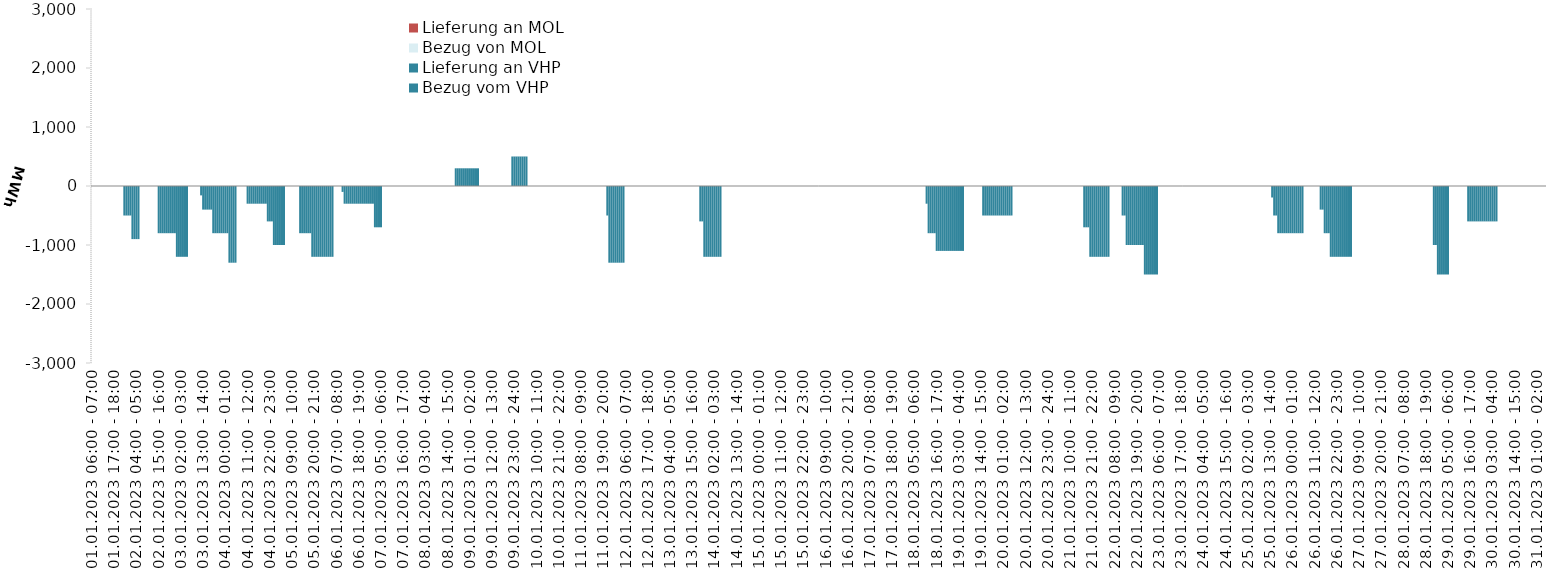
| Category | Bezug vom VHP | Lieferung an VHP | Bezug von MOL | Lieferung an MOL |
|---|---|---|---|---|
| 01.01.2023 06:00 - 07:00 | 0 | 0 | 0 | 0 |
| 01.01.2023 07:00 - 08:00 | 0 | 0 | 0 | 0 |
| 01.01.2023 08:00 - 09:00 | 0 | 0 | 0 | 0 |
| 01.01.2023 09:00 - 10:00 | 0 | 0 | 0 | 0 |
| 01.01.2023 10:00 - 11:00 | 0 | 0 | 0 | 0 |
| 01.01.2023 11:00 - 12:00 | 0 | 0 | 0 | 0 |
| 01.01.2023 12:00 - 13:00 | 0 | 0 | 0 | 0 |
| 01.01.2023 13:00 - 14:00 | 0 | 0 | 0 | 0 |
| 01.01.2023 14:00 - 15:00 | 0 | 0 | 0 | 0 |
| 01.01.2023 15:00 - 16:00 | 0 | 0 | 0 | 0 |
| 01.01.2023 16:00 - 17:00 | 0 | 0 | 0 | 0 |
| 01.01.2023 17:00 - 18:00 | 0 | 0 | 0 | 0 |
| 01.01.2023 18:00 - 19:00 | 0 | 0 | 0 | 0 |
| 01.01.2023 19:00 - 20:00 | 0 | 0 | 0 | 0 |
| 01.01.2023 20:00 - 21:00 | 0 | 0 | 0 | 0 |
| 01.01.2023 21:00 - 22:00 | 0 | 0 | 0 | 0 |
| 01.01.2023 22:00 - 23:00 | 0 | -500 | 0 | 0 |
| 01.01.2023 23:00 - 24:00 | 0 | -500 | 0 | 0 |
| 02.01.2023 00:00 - 01:00 | 0 | -500 | 0 | 0 |
| 02.01.2023 01:00 - 02:00 | 0 | -500 | 0 | 0 |
| 02.01.2023 02:00 - 03:00 | 0 | -900 | 0 | 0 |
| 02.01.2023 03:00 - 04:00 | 0 | -900 | 0 | 0 |
| 02.01.2023 04:00 - 05:00 | 0 | -900 | 0 | 0 |
| 02.01.2023 05:00 - 06:00 | 0 | -900 | 0 | 0 |
| 02.01.2023 06:00 - 07:00 | 0 | 0 | 0 | 0 |
| 02.01.2023 07:00 - 08:00 | 0 | 0 | 0 | 0 |
| 02.01.2023 08:00 - 09:00 | 0 | 0 | 0 | 0 |
| 02.01.2023 09:00 - 10:00 | 0 | 0 | 0 | 0 |
| 02.01.2023 10:00 - 11:00 | 0 | 0 | 0 | 0 |
| 02.01.2023 11:00 - 12:00 | 0 | 0 | 0 | 0 |
| 02.01.2023 12:00 - 13:00 | 0 | 0 | 0 | 0 |
| 02.01.2023 13:00 - 14:00 | 0 | 0 | 0 | 0 |
| 02.01.2023 14:00 - 15:00 | 0 | 0 | 0 | 0 |
| 02.01.2023 15:00 - 16:00 | 0 | -800 | 0 | 0 |
| 02.01.2023 16:00 - 17:00 | 0 | -800 | 0 | 0 |
| 02.01.2023 17:00 - 18:00 | 0 | -800 | 0 | 0 |
| 02.01.2023 18:00 - 19:00 | 0 | -800 | 0 | 0 |
| 02.01.2023 19:00 - 20:00 | 0 | -800 | 0 | 0 |
| 02.01.2023 20:00 - 21:00 | 0 | -800 | 0 | 0 |
| 02.01.2023 21:00 - 22:00 | 0 | -800 | 0 | 0 |
| 02.01.2023 22:00 - 23:00 | 0 | -800 | 0 | 0 |
| 02.01.2023 23:00 - 24:00 | 0 | -800 | 0 | 0 |
| 03.01.2023 00:00 - 01:00 | 0 | -1200 | 0 | 0 |
| 03.01.2023 01:00 - 02:00 | 0 | -1200 | 0 | 0 |
| 03.01.2023 02:00 - 03:00 | 0 | -1200 | 0 | 0 |
| 03.01.2023 03:00 - 04:00 | 0 | -1200 | 0 | 0 |
| 03.01.2023 04:00 - 05:00 | 0 | -1200 | 0 | 0 |
| 03.01.2023 05:00 - 06:00 | 0 | -1200 | 0 | 0 |
| 03.01.2023 06:00 - 07:00 | 0 | 0 | 0 | 0 |
| 03.01.2023 07:00 - 08:00 | 0 | 0 | 0 | 0 |
| 03.01.2023 08:00 - 09:00 | 0 | 0 | 0 | 0 |
| 03.01.2023 09:00 - 10:00 | 0 | 0 | 0 | 0 |
| 03.01.2023 10:00 - 11:00 | 0 | 0 | 0 | 0 |
| 03.01.2023 11:00 - 12:00 | 0 | 0 | 0 | 0 |
| 03.01.2023 12:00 - 13:00 | 0 | -159 | 0 | 0 |
| 03.01.2023 13:00 - 14:00 | 0 | -400 | 0 | 0 |
| 03.01.2023 14:00 - 15:00 | 0 | -400 | 0 | 0 |
| 03.01.2023 15:00 - 16:00 | 0 | -400 | 0 | 0 |
| 03.01.2023 16:00 - 17:00 | 0 | -400 | 0 | 0 |
| 03.01.2023 17:00 - 18:00 | 0 | -400 | 0 | 0 |
| 03.01.2023 18:00 - 19:00 | 0 | -800 | 0 | 0 |
| 03.01.2023 19:00 - 20:00 | 0 | -800 | 0 | 0 |
| 03.01.2023 20:00 - 21:00 | 0 | -800 | 0 | 0 |
| 03.01.2023 21:00 - 22:00 | 0 | -800 | 0 | 0 |
| 03.01.2023 22:00 - 23:00 | 0 | -800 | 0 | 0 |
| 03.01.2023 23:00 - 24:00 | 0 | -800 | 0 | 0 |
| 04.01.2023 00:00 - 01:00 | 0 | -800 | 0 | 0 |
| 04.01.2023 01:00 - 02:00 | 0 | -800 | 0 | 0 |
| 04.01.2023 02:00 - 03:00 | 0 | -1300 | 0 | 0 |
| 04.01.2023 03:00 - 04:00 | 0 | -1300 | 0 | 0 |
| 04.01.2023 04:00 - 05:00 | 0 | -1300 | 0 | 0 |
| 04.01.2023 05:00 - 06:00 | 0 | -1300 | 0 | 0 |
| 04.01.2023 06:00 - 07:00 | 0 | 0 | 0 | 0 |
| 04.01.2023 07:00 - 08:00 | 0 | 0 | 0 | 0 |
| 04.01.2023 08:00 - 09:00 | 0 | 0 | 0 | 0 |
| 04.01.2023 09:00 - 10:00 | 0 | 0 | 0 | 0 |
| 04.01.2023 10:00 - 11:00 | 0 | 0 | 0 | 0 |
| 04.01.2023 11:00 - 12:00 | 0 | -300 | 0 | 0 |
| 04.01.2023 12:00 - 13:00 | 0 | -300 | 0 | 0 |
| 04.01.2023 13:00 - 14:00 | 0 | -300 | 0 | 0 |
| 04.01.2023 14:00 - 15:00 | 0 | -300 | 0 | 0 |
| 04.01.2023 15:00 - 16:00 | 0 | -300 | 0 | 0 |
| 04.01.2023 16:00 - 17:00 | 0 | -300 | 0 | 0 |
| 04.01.2023 17:00 - 18:00 | 0 | -300 | 0 | 0 |
| 04.01.2023 18:00 - 19:00 | 0 | -300 | 0 | 0 |
| 04.01.2023 19:00 - 20:00 | 0 | -300 | 0 | 0 |
| 04.01.2023 20:00 - 21:00 | 0 | -300 | 0 | 0 |
| 04.01.2023 21:00 - 22:00 | 0 | -600 | 0 | 0 |
| 04.01.2023 22:00 - 23:00 | 0 | -600 | 0 | 0 |
| 04.01.2023 23:00 - 24:00 | 0 | -600 | 0 | 0 |
| 05.01.2023 00:00 - 01:00 | 0 | -1000 | 0 | 0 |
| 05.01.2023 01:00 - 02:00 | 0 | -1000 | 0 | 0 |
| 05.01.2023 02:00 - 03:00 | 0 | -1000 | 0 | 0 |
| 05.01.2023 03:00 - 04:00 | 0 | -1000 | 0 | 0 |
| 05.01.2023 04:00 - 05:00 | 0 | -1000 | 0 | 0 |
| 05.01.2023 05:00 - 06:00 | 0 | -1000 | 0 | 0 |
| 05.01.2023 06:00 - 07:00 | 0 | 0 | 0 | 0 |
| 05.01.2023 07:00 - 08:00 | 0 | 0 | 0 | 0 |
| 05.01.2023 08:00 - 09:00 | 0 | 0 | 0 | 0 |
| 05.01.2023 09:00 - 10:00 | 0 | 0 | 0 | 0 |
| 05.01.2023 10:00 - 11:00 | 0 | 0 | 0 | 0 |
| 05.01.2023 11:00 - 12:00 | 0 | 0 | 0 | 0 |
| 05.01.2023 12:00 - 13:00 | 0 | 0 | 0 | 0 |
| 05.01.2023 13:00 - 14:00 | 0 | -800 | 0 | 0 |
| 05.01.2023 14:00 - 15:00 | 0 | -800 | 0 | 0 |
| 05.01.2023 15:00 - 16:00 | 0 | -800 | 0 | 0 |
| 05.01.2023 16:00 - 17:00 | 0 | -800 | 0 | 0 |
| 05.01.2023 17:00 - 18:00 | 0 | -800 | 0 | 0 |
| 05.01.2023 18:00 - 19:00 | 0 | -800 | 0 | 0 |
| 05.01.2023 19:00 - 20:00 | 0 | -1200 | 0 | 0 |
| 05.01.2023 20:00 - 21:00 | 0 | -1200 | 0 | 0 |
| 05.01.2023 21:00 - 22:00 | 0 | -1200 | 0 | 0 |
| 05.01.2023 22:00 - 23:00 | 0 | -1200 | 0 | 0 |
| 05.01.2023 23:00 - 24:00 | 0 | -1200 | 0 | 0 |
| 06.01.2023 00:00 - 01:00 | 0 | -1200 | 0 | 0 |
| 06.01.2023 01:00 - 02:00 | 0 | -1200 | 0 | 0 |
| 06.01.2023 02:00 - 03:00 | 0 | -1200 | 0 | 0 |
| 06.01.2023 03:00 - 04:00 | 0 | -1200 | 0 | 0 |
| 06.01.2023 04:00 - 05:00 | 0 | -1200 | 0 | 0 |
| 06.01.2023 05:00 - 06:00 | 0 | -1200 | 0 | 0 |
| 06.01.2023 06:00 - 07:00 | 0 | 0 | 0 | 0 |
| 06.01.2023 07:00 - 08:00 | 0 | 0 | 0 | 0 |
| 06.01.2023 08:00 - 09:00 | 0 | 0 | 0 | 0 |
| 06.01.2023 09:00 - 10:00 | 0 | 0 | 0 | 0 |
| 06.01.2023 10:00 - 11:00 | 0 | -100 | 0 | 0 |
| 06.01.2023 11:00 - 12:00 | 0 | -300 | 0 | 0 |
| 06.01.2023 12:00 - 13:00 | 0 | -300 | 0 | 0 |
| 06.01.2023 13:00 - 14:00 | 0 | -300 | 0 | 0 |
| 06.01.2023 14:00 - 15:00 | 0 | -300 | 0 | 0 |
| 06.01.2023 15:00 - 16:00 | 0 | -300 | 0 | 0 |
| 06.01.2023 16:00 - 17:00 | 0 | -300 | 0 | 0 |
| 06.01.2023 17:00 - 18:00 | 0 | -300 | 0 | 0 |
| 06.01.2023 18:00 - 19:00 | 0 | -300 | 0 | 0 |
| 06.01.2023 19:00 - 20:00 | 0 | -300 | 0 | 0 |
| 06.01.2023 20:00 - 21:00 | 0 | -300 | 0 | 0 |
| 06.01.2023 21:00 - 22:00 | 0 | -300 | 0 | 0 |
| 06.01.2023 22:00 - 23:00 | 0 | -300 | 0 | 0 |
| 06.01.2023 23:00 - 24:00 | 0 | -300 | 0 | 0 |
| 07.01.2023 00:00 - 01:00 | 0 | -300 | 0 | 0 |
| 07.01.2023 01:00 - 02:00 | 0 | -300 | 0 | 0 |
| 07.01.2023 02:00 - 03:00 | 0 | -700 | 0 | 0 |
| 07.01.2023 03:00 - 04:00 | 0 | -700 | 0 | 0 |
| 07.01.2023 04:00 - 05:00 | 0 | -700 | 0 | 0 |
| 07.01.2023 05:00 - 06:00 | 0 | -700 | 0 | 0 |
| 07.01.2023 06:00 - 07:00 | 0 | 0 | 0 | 0 |
| 07.01.2023 07:00 - 08:00 | 0 | 0 | 0 | 0 |
| 07.01.2023 08:00 - 09:00 | 0 | 0 | 0 | 0 |
| 07.01.2023 09:00 - 10:00 | 0 | 0 | 0 | 0 |
| 07.01.2023 10:00 - 11:00 | 0 | 0 | 0 | 0 |
| 07.01.2023 11:00 - 12:00 | 0 | 0 | 0 | 0 |
| 07.01.2023 12:00 - 13:00 | 0 | 0 | 0 | 0 |
| 07.01.2023 13:00 - 14:00 | 0 | 0 | 0 | 0 |
| 07.01.2023 14:00 - 15:00 | 0 | 0 | 0 | 0 |
| 07.01.2023 15:00 - 16:00 | 0 | 0 | 0 | 0 |
| 07.01.2023 16:00 - 17:00 | 0 | 0 | 0 | 0 |
| 07.01.2023 17:00 - 18:00 | 0 | 0 | 0 | 0 |
| 07.01.2023 18:00 - 19:00 | 0 | 0 | 0 | 0 |
| 07.01.2023 19:00 - 20:00 | 0 | 0 | 0 | 0 |
| 07.01.2023 20:00 - 21:00 | 0 | 0 | 0 | 0 |
| 07.01.2023 21:00 - 22:00 | 0 | 0 | 0 | 0 |
| 07.01.2023 22:00 - 23:00 | 0 | 0 | 0 | 0 |
| 07.01.2023 23:00 - 24:00 | 0 | 0 | 0 | 0 |
| 08.01.2023 00:00 - 01:00 | 0 | 0 | 0 | 0 |
| 08.01.2023 01:00 - 02:00 | 0 | 0 | 0 | 0 |
| 08.01.2023 02:00 - 03:00 | 0 | 0 | 0 | 0 |
| 08.01.2023 03:00 - 04:00 | 0 | 0 | 0 | 0 |
| 08.01.2023 04:00 - 05:00 | 0 | 0 | 0 | 0 |
| 08.01.2023 05:00 - 06:00 | 0 | 0 | 0 | 0 |
| 08.01.2023 06:00 - 07:00 | 0 | 0 | 0 | 0 |
| 08.01.2023 07:00 - 08:00 | 0 | 0 | 0 | 0 |
| 08.01.2023 08:00 - 09:00 | 0 | 0 | 0 | 0 |
| 08.01.2023 09:00 - 10:00 | 0 | 0 | 0 | 0 |
| 08.01.2023 10:00 - 11:00 | 0 | 0 | 0 | 0 |
| 08.01.2023 11:00 - 12:00 | 0 | 0 | 0 | 0 |
| 08.01.2023 12:00 - 13:00 | 0 | 0 | 0 | 0 |
| 08.01.2023 13:00 - 14:00 | 0 | 0 | 0 | 0 |
| 08.01.2023 14:00 - 15:00 | 0 | 0 | 0 | 0 |
| 08.01.2023 15:00 - 16:00 | 0 | 0 | 0 | 0 |
| 08.01.2023 16:00 - 17:00 | 0 | 0 | 0 | 0 |
| 08.01.2023 17:00 - 18:00 | 0 | 0 | 0 | 0 |
| 08.01.2023 18:00 - 19:00 | 300 | 0 | 0 | 0 |
| 08.01.2023 19:00 - 20:00 | 300 | 0 | 0 | 0 |
| 08.01.2023 20:00 - 21:00 | 300 | 0 | 0 | 0 |
| 08.01.2023 21:00 - 22:00 | 300 | 0 | 0 | 0 |
| 08.01.2023 22:00 - 23:00 | 300 | 0 | 0 | 0 |
| 08.01.2023 23:00 - 24:00 | 300 | 0 | 0 | 0 |
| 09.01.2023 00:00 - 01:00 | 300 | 0 | 0 | 0 |
| 09.01.2023 01:00 - 02:00 | 300 | 0 | 0 | 0 |
| 09.01.2023 02:00 - 03:00 | 300 | 0 | 0 | 0 |
| 09.01.2023 03:00 - 04:00 | 300 | 0 | 0 | 0 |
| 09.01.2023 04:00 - 05:00 | 300 | 0 | 0 | 0 |
| 09.01.2023 05:00 - 06:00 | 300 | 0 | 0 | 0 |
| 09.01.2023 06:00 - 07:00 | 0 | 0 | 0 | 0 |
| 09.01.2023 07:00 - 08:00 | 0 | 0 | 0 | 0 |
| 09.01.2023 08:00 - 09:00 | 0 | 0 | 0 | 0 |
| 09.01.2023 09:00 - 10:00 | 0 | 0 | 0 | 0 |
| 09.01.2023 10:00 - 11:00 | 0 | 0 | 0 | 0 |
| 09.01.2023 11:00 - 12:00 | 0 | 0 | 0 | 0 |
| 09.01.2023 12:00 - 13:00 | 0 | 0 | 0 | 0 |
| 09.01.2023 13:00 - 14:00 | 0 | 0 | 0 | 0 |
| 09.01.2023 14:00 - 15:00 | 0 | 0 | 0 | 0 |
| 09.01.2023 15:00 - 16:00 | 0 | 0 | 0 | 0 |
| 09.01.2023 16:00 - 17:00 | 0 | 0 | 0 | 0 |
| 09.01.2023 17:00 - 18:00 | 0 | 0 | 0 | 0 |
| 09.01.2023 18:00 - 19:00 | 0 | 0 | 0 | 0 |
| 09.01.2023 19:00 - 20:00 | 0 | 0 | 0 | 0 |
| 09.01.2023 20:00 - 21:00 | 0 | 0 | 0 | 0 |
| 09.01.2023 21:00 - 22:00 | 0 | 0 | 0 | 0 |
| 09.01.2023 22:00 - 23:00 | 500 | 0 | 0 | 0 |
| 09.01.2023 23:00 - 24:00 | 500 | 0 | 0 | 0 |
| 10.01.2023 00:00 - 01:00 | 500 | 0 | 0 | 0 |
| 10.01.2023 01:00 - 02:00 | 500 | 0 | 0 | 0 |
| 10.01.2023 02:00 - 03:00 | 500 | 0 | 0 | 0 |
| 10.01.2023 03:00 - 04:00 | 500 | 0 | 0 | 0 |
| 10.01.2023 04:00 - 05:00 | 500 | 0 | 0 | 0 |
| 10.01.2023 05:00 - 06:00 | 500 | 0 | 0 | 0 |
| 10.01.2023 06:00 - 07:00 | 0 | 0 | 0 | 0 |
| 10.01.2023 07:00 - 08:00 | 0 | 0 | 0 | 0 |
| 10.01.2023 08:00 - 09:00 | 0 | 0 | 0 | 0 |
| 10.01.2023 09:00 - 10:00 | 0 | 0 | 0 | 0 |
| 10.01.2023 10:00 - 11:00 | 0 | 0 | 0 | 0 |
| 10.01.2023 11:00 - 12:00 | 0 | 0 | 0 | 0 |
| 10.01.2023 12:00 - 13:00 | 0 | 0 | 0 | 0 |
| 10.01.2023 13:00 - 14:00 | 0 | 0 | 0 | 0 |
| 10.01.2023 14:00 - 15:00 | 0 | 0 | 0 | 0 |
| 10.01.2023 15:00 - 16:00 | 0 | 0 | 0 | 0 |
| 10.01.2023 16:00 - 17:00 | 0 | 0 | 0 | 0 |
| 10.01.2023 17:00 - 18:00 | 0 | 0 | 0 | 0 |
| 10.01.2023 18:00 - 19:00 | 0 | 0 | 0 | 0 |
| 10.01.2023 19:00 - 20:00 | 0 | 0 | 0 | 0 |
| 10.01.2023 20:00 - 21:00 | 0 | 0 | 0 | 0 |
| 10.01.2023 21:00 - 22:00 | 0 | 0 | 0 | 0 |
| 10.01.2023 22:00 - 23:00 | 0 | 0 | 0 | 0 |
| 10.01.2023 23:00 - 24:00 | 0 | 0 | 0 | 0 |
| 11.01.2023 00:00 - 01:00 | 0 | 0 | 0 | 0 |
| 11.01.2023 01:00 - 02:00 | 0 | 0 | 0 | 0 |
| 11.01.2023 02:00 - 03:00 | 0 | 0 | 0 | 0 |
| 11.01.2023 03:00 - 04:00 | 0 | 0 | 0 | 0 |
| 11.01.2023 04:00 - 05:00 | 0 | 0 | 0 | 0 |
| 11.01.2023 05:00 - 06:00 | 0 | 0 | 0 | 0 |
| 11.01.2023 06:00 - 07:00 | 0 | 0 | 0 | 0 |
| 11.01.2023 07:00 - 08:00 | 0 | 0 | 0 | 0 |
| 11.01.2023 08:00 - 09:00 | 0 | 0 | 0 | 0 |
| 11.01.2023 09:00 - 10:00 | 0 | 0 | 0 | 0 |
| 11.01.2023 10:00 - 11:00 | 0 | 0 | 0 | 0 |
| 11.01.2023 11:00 - 12:00 | 0 | 0 | 0 | 0 |
| 11.01.2023 12:00 - 13:00 | 0 | 0 | 0 | 0 |
| 11.01.2023 13:00 - 14:00 | 0 | 0 | 0 | 0 |
| 11.01.2023 14:00 - 15:00 | 0 | 0 | 0 | 0 |
| 11.01.2023 15:00 - 16:00 | 0 | 0 | 0 | 0 |
| 11.01.2023 16:00 - 17:00 | 0 | 0 | 0 | 0 |
| 11.01.2023 17:00 - 18:00 | 0 | 0 | 0 | 0 |
| 11.01.2023 18:00 - 19:00 | 0 | 0 | 0 | 0 |
| 11.01.2023 19:00 - 20:00 | 0 | 0 | 0 | 0 |
| 11.01.2023 20:00 - 21:00 | 0 | 0 | 0 | 0 |
| 11.01.2023 21:00 - 22:00 | 0 | -500 | 0 | 0 |
| 11.01.2023 22:00 - 23:00 | 0 | -1300 | 0 | 0 |
| 11.01.2023 23:00 - 24:00 | 0 | -1300 | 0 | 0 |
| 12.01.2023 00:00 - 01:00 | 0 | -1300 | 0 | 0 |
| 12.01.2023 01:00 - 02:00 | 0 | -1300 | 0 | 0 |
| 12.01.2023 02:00 - 03:00 | 0 | -1300 | 0 | 0 |
| 12.01.2023 03:00 - 04:00 | 0 | -1300 | 0 | 0 |
| 12.01.2023 04:00 - 05:00 | 0 | -1300 | 0 | 0 |
| 12.01.2023 05:00 - 06:00 | 0 | -1300 | 0 | 0 |
| 12.01.2023 06:00 - 07:00 | 0 | 0 | 0 | 0 |
| 12.01.2023 07:00 - 08:00 | 0 | 0 | 0 | 0 |
| 12.01.2023 08:00 - 09:00 | 0 | 0 | 0 | 0 |
| 12.01.2023 09:00 - 10:00 | 0 | 0 | 0 | 0 |
| 12.01.2023 10:00 - 11:00 | 0 | 0 | 0 | 0 |
| 12.01.2023 11:00 - 12:00 | 0 | 0 | 0 | 0 |
| 12.01.2023 12:00 - 13:00 | 0 | 0 | 0 | 0 |
| 12.01.2023 13:00 - 14:00 | 0 | 0 | 0 | 0 |
| 12.01.2023 14:00 - 15:00 | 0 | 0 | 0 | 0 |
| 12.01.2023 15:00 - 16:00 | 0 | 0 | 0 | 0 |
| 12.01.2023 16:00 - 17:00 | 0 | 0 | 0 | 0 |
| 12.01.2023 17:00 - 18:00 | 0 | 0 | 0 | 0 |
| 12.01.2023 18:00 - 19:00 | 0 | 0 | 0 | 0 |
| 12.01.2023 19:00 - 20:00 | 0 | 0 | 0 | 0 |
| 12.01.2023 20:00 - 21:00 | 0 | 0 | 0 | 0 |
| 12.01.2023 21:00 - 22:00 | 0 | 0 | 0 | 0 |
| 12.01.2023 22:00 - 23:00 | 0 | 0 | 0 | 0 |
| 12.01.2023 23:00 - 24:00 | 0 | 0 | 0 | 0 |
| 13.01.2023 00:00 - 01:00 | 0 | 0 | 0 | 0 |
| 13.01.2023 01:00 - 02:00 | 0 | 0 | 0 | 0 |
| 13.01.2023 02:00 - 03:00 | 0 | 0 | 0 | 0 |
| 13.01.2023 03:00 - 04:00 | 0 | 0 | 0 | 0 |
| 13.01.2023 04:00 - 05:00 | 0 | 0 | 0 | 0 |
| 13.01.2023 05:00 - 06:00 | 0 | 0 | 0 | 0 |
| 13.01.2023 06:00 - 07:00 | 0 | 0 | 0 | 0 |
| 13.01.2023 07:00 - 08:00 | 0 | 0 | 0 | 0 |
| 13.01.2023 08:00 - 09:00 | 0 | 0 | 0 | 0 |
| 13.01.2023 09:00 - 10:00 | 0 | 0 | 0 | 0 |
| 13.01.2023 10:00 - 11:00 | 0 | 0 | 0 | 0 |
| 13.01.2023 11:00 - 12:00 | 0 | 0 | 0 | 0 |
| 13.01.2023 12:00 - 13:00 | 0 | 0 | 0 | 0 |
| 13.01.2023 13:00 - 14:00 | 0 | 0 | 0 | 0 |
| 13.01.2023 14:00 - 15:00 | 0 | 0 | 0 | 0 |
| 13.01.2023 15:00 - 16:00 | 0 | 0 | 0 | 0 |
| 13.01.2023 16:00 - 17:00 | 0 | 0 | 0 | 0 |
| 13.01.2023 17:00 - 18:00 | 0 | 0 | 0 | 0 |
| 13.01.2023 18:00 - 19:00 | 0 | 0 | 0 | 0 |
| 13.01.2023 19:00 - 20:00 | 0 | -600 | 0 | 0 |
| 13.01.2023 20:00 - 21:00 | 0 | -600 | 0 | 0 |
| 13.01.2023 21:00 - 22:00 | 0 | -1200 | 0 | 0 |
| 13.01.2023 22:00 - 23:00 | 0 | -1200 | 0 | 0 |
| 13.01.2023 23:00 - 24:00 | 0 | -1200 | 0 | 0 |
| 14.01.2023 00:00 - 01:00 | 0 | -1200 | 0 | 0 |
| 14.01.2023 01:00 - 02:00 | 0 | -1200 | 0 | 0 |
| 14.01.2023 02:00 - 03:00 | 0 | -1200 | 0 | 0 |
| 14.01.2023 03:00 - 04:00 | 0 | -1200 | 0 | 0 |
| 14.01.2023 04:00 - 05:00 | 0 | -1200 | 0 | 0 |
| 14.01.2023 05:00 - 06:00 | 0 | -1200 | 0 | 0 |
| 14.01.2023 06:00 - 07:00 | 0 | 0 | 0 | 0 |
| 14.01.2023 07:00 - 08:00 | 0 | 0 | 0 | 0 |
| 14.01.2023 08:00 - 09:00 | 0 | 0 | 0 | 0 |
| 14.01.2023 09:00 - 10:00 | 0 | 0 | 0 | 0 |
| 14.01.2023 10:00 - 11:00 | 0 | 0 | 0 | 0 |
| 14.01.2023 11:00 - 12:00 | 0 | 0 | 0 | 0 |
| 14.01.2023 12:00 - 13:00 | 0 | 0 | 0 | 0 |
| 14.01.2023 13:00 - 14:00 | 0 | 0 | 0 | 0 |
| 14.01.2023 14:00 - 15:00 | 0 | 0 | 0 | 0 |
| 14.01.2023 15:00 - 16:00 | 0 | 0 | 0 | 0 |
| 14.01.2023 16:00 - 17:00 | 0 | 0 | 0 | 0 |
| 14.01.2023 17:00 - 18:00 | 0 | 0 | 0 | 0 |
| 14.01.2023 18:00 - 19:00 | 0 | 0 | 0 | 0 |
| 14.01.2023 19:00 - 20:00 | 0 | 0 | 0 | 0 |
| 14.01.2023 20:00 - 21:00 | 0 | 0 | 0 | 0 |
| 14.01.2023 21:00 - 22:00 | 0 | 0 | 0 | 0 |
| 14.01.2023 22:00 - 23:00 | 0 | 0 | 0 | 0 |
| 14.01.2023 23:00 - 24:00 | 0 | 0 | 0 | 0 |
| 15.01.2023 00:00 - 01:00 | 0 | 0 | 0 | 0 |
| 15.01.2023 01:00 - 02:00 | 0 | 0 | 0 | 0 |
| 15.01.2023 02:00 - 03:00 | 0 | 0 | 0 | 0 |
| 15.01.2023 03:00 - 04:00 | 0 | 0 | 0 | 0 |
| 15.01.2023 04:00 - 05:00 | 0 | 0 | 0 | 0 |
| 15.01.2023 05:00 - 06:00 | 0 | 0 | 0 | 0 |
| 15.01.2023 06:00 - 07:00 | 0 | 0 | 0 | 0 |
| 15.01.2023 07:00 - 08:00 | 0 | 0 | 0 | 0 |
| 15.01.2023 08:00 - 09:00 | 0 | 0 | 0 | 0 |
| 15.01.2023 09:00 - 10:00 | 0 | 0 | 0 | 0 |
| 15.01.2023 10:00 - 11:00 | 0 | 0 | 0 | 0 |
| 15.01.2023 11:00 - 12:00 | 0 | 0 | 0 | 0 |
| 15.01.2023 12:00 - 13:00 | 0 | 0 | 0 | 0 |
| 15.01.2023 13:00 - 14:00 | 0 | 0 | 0 | 0 |
| 15.01.2023 14:00 - 15:00 | 0 | 0 | 0 | 0 |
| 15.01.2023 15:00 - 16:00 | 0 | 0 | 0 | 0 |
| 15.01.2023 16:00 - 17:00 | 0 | 0 | 0 | 0 |
| 15.01.2023 17:00 - 18:00 | 0 | 0 | 0 | 0 |
| 15.01.2023 18:00 - 19:00 | 0 | 0 | 0 | 0 |
| 15.01.2023 19:00 - 20:00 | 0 | 0 | 0 | 0 |
| 15.01.2023 20:00 - 21:00 | 0 | 0 | 0 | 0 |
| 15.01.2023 21:00 - 22:00 | 0 | 0 | 0 | 0 |
| 15.01.2023 22:00 - 23:00 | 0 | 0 | 0 | 0 |
| 15.01.2023 23:00 - 24:00 | 0 | 0 | 0 | 0 |
| 16.01.2023 00:00 - 01:00 | 0 | 0 | 0 | 0 |
| 16.01.2023 01:00 - 02:00 | 0 | 0 | 0 | 0 |
| 16.01.2023 02:00 - 03:00 | 0 | 0 | 0 | 0 |
| 16.01.2023 03:00 - 04:00 | 0 | 0 | 0 | 0 |
| 16.01.2023 04:00 - 05:00 | 0 | 0 | 0 | 0 |
| 16.01.2023 05:00 - 06:00 | 0 | 0 | 0 | 0 |
| 16.01.2023 06:00 - 07:00 | 0 | 0 | 0 | 0 |
| 16.01.2023 07:00 - 08:00 | 0 | 0 | 0 | 0 |
| 16.01.2023 08:00 - 09:00 | 0 | 0 | 0 | 0 |
| 16.01.2023 09:00 - 10:00 | 0 | 0 | 0 | 0 |
| 16.01.2023 10:00 - 11:00 | 0 | 0 | 0 | 0 |
| 16.01.2023 11:00 - 12:00 | 0 | 0 | 0 | 0 |
| 16.01.2023 12:00 - 13:00 | 0 | 0 | 0 | 0 |
| 16.01.2023 13:00 - 14:00 | 0 | 0 | 0 | 0 |
| 16.01.2023 14:00 - 15:00 | 0 | 0 | 0 | 0 |
| 16.01.2023 15:00 - 16:00 | 0 | 0 | 0 | 0 |
| 16.01.2023 16:00 - 17:00 | 0 | 0 | 0 | 0 |
| 16.01.2023 17:00 - 18:00 | 0 | 0 | 0 | 0 |
| 16.01.2023 18:00 - 19:00 | 0 | 0 | 0 | 0 |
| 16.01.2023 19:00 - 20:00 | 0 | 0 | 0 | 0 |
| 16.01.2023 20:00 - 21:00 | 0 | 0 | 0 | 0 |
| 16.01.2023 21:00 - 22:00 | 0 | 0 | 0 | 0 |
| 16.01.2023 22:00 - 23:00 | 0 | 0 | 0 | 0 |
| 16.01.2023 23:00 - 24:00 | 0 | 0 | 0 | 0 |
| 17.01.2023 00:00 - 01:00 | 0 | 0 | 0 | 0 |
| 17.01.2023 01:00 - 02:00 | 0 | 0 | 0 | 0 |
| 17.01.2023 02:00 - 03:00 | 0 | 0 | 0 | 0 |
| 17.01.2023 03:00 - 04:00 | 0 | 0 | 0 | 0 |
| 17.01.2023 04:00 - 05:00 | 0 | 0 | 0 | 0 |
| 17.01.2023 05:00 - 06:00 | 0 | 0 | 0 | 0 |
| 17.01.2023 06:00 - 07:00 | 0 | 0 | 0 | 0 |
| 17.01.2023 07:00 - 08:00 | 0 | 0 | 0 | 0 |
| 17.01.2023 08:00 - 09:00 | 0 | 0 | 0 | 0 |
| 17.01.2023 09:00 - 10:00 | 0 | 0 | 0 | 0 |
| 17.01.2023 10:00 - 11:00 | 0 | 0 | 0 | 0 |
| 17.01.2023 11:00 - 12:00 | 0 | 0 | 0 | 0 |
| 17.01.2023 12:00 - 13:00 | 0 | 0 | 0 | 0 |
| 17.01.2023 13:00 - 14:00 | 0 | 0 | 0 | 0 |
| 17.01.2023 14:00 - 15:00 | 0 | 0 | 0 | 0 |
| 17.01.2023 15:00 - 16:00 | 0 | 0 | 0 | 0 |
| 17.01.2023 16:00 - 17:00 | 0 | 0 | 0 | 0 |
| 17.01.2023 17:00 - 18:00 | 0 | 0 | 0 | 0 |
| 17.01.2023 18:00 - 19:00 | 0 | 0 | 0 | 0 |
| 17.01.2023 19:00 - 20:00 | 0 | 0 | 0 | 0 |
| 17.01.2023 20:00 - 21:00 | 0 | 0 | 0 | 0 |
| 17.01.2023 21:00 - 22:00 | 0 | 0 | 0 | 0 |
| 17.01.2023 22:00 - 23:00 | 0 | 0 | 0 | 0 |
| 17.01.2023 23:00 - 24:00 | 0 | 0 | 0 | 0 |
| 18.01.2023 00:00 - 01:00 | 0 | 0 | 0 | 0 |
| 18.01.2023 01:00 - 02:00 | 0 | 0 | 0 | 0 |
| 18.01.2023 02:00 - 03:00 | 0 | 0 | 0 | 0 |
| 18.01.2023 03:00 - 04:00 | 0 | 0 | 0 | 0 |
| 18.01.2023 04:00 - 05:00 | 0 | 0 | 0 | 0 |
| 18.01.2023 05:00 - 06:00 | 0 | 0 | 0 | 0 |
| 18.01.2023 06:00 - 07:00 | 0 | 0 | 0 | 0 |
| 18.01.2023 07:00 - 08:00 | 0 | 0 | 0 | 0 |
| 18.01.2023 08:00 - 09:00 | 0 | 0 | 0 | 0 |
| 18.01.2023 09:00 - 10:00 | 0 | 0 | 0 | 0 |
| 18.01.2023 10:00 - 11:00 | 0 | 0 | 0 | 0 |
| 18.01.2023 11:00 - 12:00 | 0 | -300 | 0 | 0 |
| 18.01.2023 12:00 - 13:00 | 0 | -800 | 0 | 0 |
| 18.01.2023 13:00 - 14:00 | 0 | -800 | 0 | 0 |
| 18.01.2023 14:00 - 15:00 | 0 | -800 | 0 | 0 |
| 18.01.2023 15:00 - 16:00 | 0 | -800 | 0 | 0 |
| 18.01.2023 16:00 - 17:00 | 0 | -1100 | 0 | 0 |
| 18.01.2023 17:00 - 18:00 | 0 | -1100 | 0 | 0 |
| 18.01.2023 18:00 - 19:00 | 0 | -1100 | 0 | 0 |
| 18.01.2023 19:00 - 20:00 | 0 | -1100 | 0 | 0 |
| 18.01.2023 20:00 - 21:00 | 0 | -1100 | 0 | 0 |
| 18.01.2023 21:00 - 22:00 | 0 | -1100 | 0 | 0 |
| 18.01.2023 22:00 - 23:00 | 0 | -1100 | 0 | 0 |
| 18.01.2023 23:00 - 24:00 | 0 | -1100 | 0 | 0 |
| 19.01.2023 00:00 - 01:00 | 0 | -1100 | 0 | 0 |
| 19.01.2023 01:00 - 02:00 | 0 | -1100 | 0 | 0 |
| 19.01.2023 02:00 - 03:00 | 0 | -1100 | 0 | 0 |
| 19.01.2023 03:00 - 04:00 | 0 | -1100 | 0 | 0 |
| 19.01.2023 04:00 - 05:00 | 0 | -1100 | 0 | 0 |
| 19.01.2023 05:00 - 06:00 | 0 | -1100 | 0 | 0 |
| 19.01.2023 06:00 - 07:00 | 0 | 0 | 0 | 0 |
| 19.01.2023 07:00 - 08:00 | 0 | 0 | 0 | 0 |
| 19.01.2023 08:00 - 09:00 | 0 | 0 | 0 | 0 |
| 19.01.2023 09:00 - 10:00 | 0 | 0 | 0 | 0 |
| 19.01.2023 10:00 - 11:00 | 0 | 0 | 0 | 0 |
| 19.01.2023 11:00 - 12:00 | 0 | 0 | 0 | 0 |
| 19.01.2023 12:00 - 13:00 | 0 | 0 | 0 | 0 |
| 19.01.2023 13:00 - 14:00 | 0 | 0 | 0 | 0 |
| 19.01.2023 14:00 - 15:00 | 0 | 0 | 0 | 0 |
| 19.01.2023 15:00 - 16:00 | 0 | -500 | 0 | 0 |
| 19.01.2023 16:00 - 17:00 | 0 | -500 | 0 | 0 |
| 19.01.2023 17:00 - 18:00 | 0 | -500 | 0 | 0 |
| 19.01.2023 18:00 - 19:00 | 0 | -500 | 0 | 0 |
| 19.01.2023 19:00 - 20:00 | 0 | -500 | 0 | 0 |
| 19.01.2023 20:00 - 21:00 | 0 | -500 | 0 | 0 |
| 19.01.2023 21:00 - 22:00 | 0 | -500 | 0 | 0 |
| 19.01.2023 22:00 - 23:00 | 0 | -500 | 0 | 0 |
| 19.01.2023 23:00 - 24:00 | 0 | -500 | 0 | 0 |
| 20.01.2023 00:00 - 01:00 | 0 | -500 | 0 | 0 |
| 20.01.2023 01:00 - 02:00 | 0 | -500 | 0 | 0 |
| 20.01.2023 02:00 - 03:00 | 0 | -500 | 0 | 0 |
| 20.01.2023 03:00 - 04:00 | 0 | -500 | 0 | 0 |
| 20.01.2023 04:00 - 05:00 | 0 | -500 | 0 | 0 |
| 20.01.2023 05:00 - 06:00 | 0 | -500 | 0 | 0 |
| 20.01.2023 06:00 - 07:00 | 0 | 0 | 0 | 0 |
| 20.01.2023 07:00 - 08:00 | 0 | 0 | 0 | 0 |
| 20.01.2023 08:00 - 09:00 | 0 | 0 | 0 | 0 |
| 20.01.2023 09:00 - 10:00 | 0 | 0 | 0 | 0 |
| 20.01.2023 10:00 - 11:00 | 0 | 0 | 0 | 0 |
| 20.01.2023 11:00 - 12:00 | 0 | 0 | 0 | 0 |
| 20.01.2023 12:00 - 13:00 | 0 | 0 | 0 | 0 |
| 20.01.2023 13:00 - 14:00 | 0 | 0 | 0 | 0 |
| 20.01.2023 14:00 - 15:00 | 0 | 0 | 0 | 0 |
| 20.01.2023 15:00 - 16:00 | 0 | 0 | 0 | 0 |
| 20.01.2023 16:00 - 17:00 | 0 | 0 | 0 | 0 |
| 20.01.2023 17:00 - 18:00 | 0 | 0 | 0 | 0 |
| 20.01.2023 18:00 - 19:00 | 0 | 0 | 0 | 0 |
| 20.01.2023 19:00 - 20:00 | 0 | 0 | 0 | 0 |
| 20.01.2023 20:00 - 21:00 | 0 | 0 | 0 | 0 |
| 20.01.2023 21:00 - 22:00 | 0 | 0 | 0 | 0 |
| 20.01.2023 22:00 - 23:00 | 0 | 0 | 0 | 0 |
| 20.01.2023 23:00 - 24:00 | 0 | 0 | 0 | 0 |
| 21.01.2023 00:00 - 01:00 | 0 | 0 | 0 | 0 |
| 21.01.2023 01:00 - 02:00 | 0 | 0 | 0 | 0 |
| 21.01.2023 02:00 - 03:00 | 0 | 0 | 0 | 0 |
| 21.01.2023 03:00 - 04:00 | 0 | 0 | 0 | 0 |
| 21.01.2023 04:00 - 05:00 | 0 | 0 | 0 | 0 |
| 21.01.2023 05:00 - 06:00 | 0 | 0 | 0 | 0 |
| 21.01.2023 06:00 - 07:00 | 0 | 0 | 0 | 0 |
| 21.01.2023 07:00 - 08:00 | 0 | 0 | 0 | 0 |
| 21.01.2023 08:00 - 09:00 | 0 | 0 | 0 | 0 |
| 21.01.2023 09:00 - 10:00 | 0 | 0 | 0 | 0 |
| 21.01.2023 10:00 - 11:00 | 0 | 0 | 0 | 0 |
| 21.01.2023 11:00 - 12:00 | 0 | 0 | 0 | 0 |
| 21.01.2023 12:00 - 13:00 | 0 | 0 | 0 | 0 |
| 21.01.2023 13:00 - 14:00 | 0 | 0 | 0 | 0 |
| 21.01.2023 14:00 - 15:00 | 0 | 0 | 0 | 0 |
| 21.01.2023 15:00 - 16:00 | 0 | 0 | 0 | 0 |
| 21.01.2023 16:00 - 17:00 | 0 | 0 | 0 | 0 |
| 21.01.2023 17:00 - 18:00 | 0 | -700 | 0 | 0 |
| 21.01.2023 18:00 - 19:00 | 0 | -700 | 0 | 0 |
| 21.01.2023 19:00 - 20:00 | 0 | -700 | 0 | 0 |
| 21.01.2023 20:00 - 21:00 | 0 | -1200 | 0 | 0 |
| 21.01.2023 21:00 - 22:00 | 0 | -1200 | 0 | 0 |
| 21.01.2023 22:00 - 23:00 | 0 | -1200 | 0 | 0 |
| 21.01.2023 23:00 - 24:00 | 0 | -1200 | 0 | 0 |
| 22.01.2023 00:00 - 01:00 | 0 | -1200 | 0 | 0 |
| 22.01.2023 01:00 - 02:00 | 0 | -1200 | 0 | 0 |
| 22.01.2023 02:00 - 03:00 | 0 | -1200 | 0 | 0 |
| 22.01.2023 03:00 - 04:00 | 0 | -1200 | 0 | 0 |
| 22.01.2023 04:00 - 05:00 | 0 | -1200 | 0 | 0 |
| 22.01.2023 05:00 - 06:00 | 0 | -1200 | 0 | 0 |
| 22.01.2023 06:00 - 07:00 | 0 | 0 | 0 | 0 |
| 22.01.2023 07:00 - 08:00 | 0 | 0 | 0 | 0 |
| 22.01.2023 08:00 - 09:00 | 0 | 0 | 0 | 0 |
| 22.01.2023 09:00 - 10:00 | 0 | 0 | 0 | 0 |
| 22.01.2023 10:00 - 11:00 | 0 | 0 | 0 | 0 |
| 22.01.2023 11:00 - 12:00 | 0 | 0 | 0 | 0 |
| 22.01.2023 12:00 - 13:00 | 0 | -500 | 0 | 0 |
| 22.01.2023 13:00 - 14:00 | 0 | -500 | 0 | 0 |
| 22.01.2023 14:00 - 15:00 | 0 | -1000 | 0 | 0 |
| 22.01.2023 15:00 - 16:00 | 0 | -1000 | 0 | 0 |
| 22.01.2023 16:00 - 17:00 | 0 | -1000 | 0 | 0 |
| 22.01.2023 17:00 - 18:00 | 0 | -1000 | 0 | 0 |
| 22.01.2023 18:00 - 19:00 | 0 | -1000 | 0 | 0 |
| 22.01.2023 19:00 - 20:00 | 0 | -1000 | 0 | 0 |
| 22.01.2023 20:00 - 21:00 | 0 | -1000 | 0 | 0 |
| 22.01.2023 21:00 - 22:00 | 0 | -1000 | 0 | 0 |
| 22.01.2023 22:00 - 23:00 | 0 | -1000 | 0 | 0 |
| 22.01.2023 23:00 - 24:00 | 0 | -1500 | 0 | 0 |
| 23.01.2023 00:00 - 01:00 | 0 | -1500 | 0 | 0 |
| 23.01.2023 01:00 - 02:00 | 0 | -1500 | 0 | 0 |
| 23.01.2023 02:00 - 03:00 | 0 | -1500 | 0 | 0 |
| 23.01.2023 03:00 - 04:00 | 0 | -1500 | 0 | 0 |
| 23.01.2023 04:00 - 05:00 | 0 | -1500 | 0 | 0 |
| 23.01.2023 05:00 - 06:00 | 0 | -1500 | 0 | 0 |
| 23.01.2023 06:00 - 07:00 | 0 | 0 | 0 | 0 |
| 23.01.2023 07:00 - 08:00 | 0 | 0 | 0 | 0 |
| 23.01.2023 08:00 - 09:00 | 0 | 0 | 0 | 0 |
| 23.01.2023 09:00 - 10:00 | 0 | 0 | 0 | 0 |
| 23.01.2023 10:00 - 11:00 | 0 | 0 | 0 | 0 |
| 23.01.2023 11:00 - 12:00 | 0 | 0 | 0 | 0 |
| 23.01.2023 12:00 - 13:00 | 0 | 0 | 0 | 0 |
| 23.01.2023 13:00 - 14:00 | 0 | 0 | 0 | 0 |
| 23.01.2023 14:00 - 15:00 | 0 | 0 | 0 | 0 |
| 23.01.2023 15:00 - 16:00 | 0 | 0 | 0 | 0 |
| 23.01.2023 16:00 - 17:00 | 0 | 0 | 0 | 0 |
| 23.01.2023 17:00 - 18:00 | 0 | 0 | 0 | 0 |
| 23.01.2023 18:00 - 19:00 | 0 | 0 | 0 | 0 |
| 23.01.2023 19:00 - 20:00 | 0 | 0 | 0 | 0 |
| 23.01.2023 20:00 - 21:00 | 0 | 0 | 0 | 0 |
| 23.01.2023 21:00 - 22:00 | 0 | 0 | 0 | 0 |
| 23.01.2023 22:00 - 23:00 | 0 | 0 | 0 | 0 |
| 23.01.2023 23:00 - 24:00 | 0 | 0 | 0 | 0 |
| 24.01.2023 00:00 - 01:00 | 0 | 0 | 0 | 0 |
| 24.01.2023 01:00 - 02:00 | 0 | 0 | 0 | 0 |
| 24.01.2023 02:00 - 03:00 | 0 | 0 | 0 | 0 |
| 24.01.2023 03:00 - 04:00 | 0 | 0 | 0 | 0 |
| 24.01.2023 04:00 - 05:00 | 0 | 0 | 0 | 0 |
| 24.01.2023 05:00 - 06:00 | 0 | 0 | 0 | 0 |
| 24.01.2023 06:00 - 07:00 | 0 | 0 | 0 | 0 |
| 24.01.2023 07:00 - 08:00 | 0 | 0 | 0 | 0 |
| 24.01.2023 08:00 - 09:00 | 0 | 0 | 0 | 0 |
| 24.01.2023 09:00 - 10:00 | 0 | 0 | 0 | 0 |
| 24.01.2023 10:00 - 11:00 | 0 | 0 | 0 | 0 |
| 24.01.2023 11:00 - 12:00 | 0 | 0 | 0 | 0 |
| 24.01.2023 12:00 - 13:00 | 0 | 0 | 0 | 0 |
| 24.01.2023 13:00 - 14:00 | 0 | 0 | 0 | 0 |
| 24.01.2023 14:00 - 15:00 | 0 | 0 | 0 | 0 |
| 24.01.2023 15:00 - 16:00 | 0 | 0 | 0 | 0 |
| 24.01.2023 16:00 - 17:00 | 0 | 0 | 0 | 0 |
| 24.01.2023 17:00 - 18:00 | 0 | 0 | 0 | 0 |
| 24.01.2023 18:00 - 19:00 | 0 | 0 | 0 | 0 |
| 24.01.2023 19:00 - 20:00 | 0 | 0 | 0 | 0 |
| 24.01.2023 20:00 - 21:00 | 0 | 0 | 0 | 0 |
| 24.01.2023 21:00 - 22:00 | 0 | 0 | 0 | 0 |
| 24.01.2023 22:00 - 23:00 | 0 | 0 | 0 | 0 |
| 24.01.2023 23:00 - 24:00 | 0 | 0 | 0 | 0 |
| 25.01.2023 00:00 - 01:00 | 0 | 0 | 0 | 0 |
| 25.01.2023 01:00 - 02:00 | 0 | 0 | 0 | 0 |
| 25.01.2023 02:00 - 03:00 | 0 | 0 | 0 | 0 |
| 25.01.2023 03:00 - 04:00 | 0 | 0 | 0 | 0 |
| 25.01.2023 04:00 - 05:00 | 0 | 0 | 0 | 0 |
| 25.01.2023 05:00 - 06:00 | 0 | 0 | 0 | 0 |
| 25.01.2023 06:00 - 07:00 | 0 | 0 | 0 | 0 |
| 25.01.2023 07:00 - 08:00 | 0 | 0 | 0 | 0 |
| 25.01.2023 08:00 - 09:00 | 0 | 0 | 0 | 0 |
| 25.01.2023 09:00 - 10:00 | 0 | 0 | 0 | 0 |
| 25.01.2023 10:00 - 11:00 | 0 | 0 | 0 | 0 |
| 25.01.2023 11:00 - 12:00 | 0 | 0 | 0 | 0 |
| 25.01.2023 12:00 - 13:00 | 0 | 0 | 0 | 0 |
| 25.01.2023 13:00 - 14:00 | 0 | 0 | 0 | 0 |
| 25.01.2023 14:00 - 15:00 | 0 | -195 | 0 | 0 |
| 25.01.2023 15:00 - 16:00 | 0 | -500 | 0 | 0 |
| 25.01.2023 16:00 - 17:00 | 0 | -500 | 0 | 0 |
| 25.01.2023 17:00 - 18:00 | 0 | -800 | 0 | 0 |
| 25.01.2023 18:00 - 19:00 | 0 | -800 | 0 | 0 |
| 25.01.2023 19:00 - 20:00 | 0 | -800 | 0 | 0 |
| 25.01.2023 20:00 - 21:00 | 0 | -800 | 0 | 0 |
| 25.01.2023 21:00 - 22:00 | 0 | -800 | 0 | 0 |
| 25.01.2023 22:00 - 23:00 | 0 | -800 | 0 | 0 |
| 25.01.2023 23:00 - 24:00 | 0 | -800 | 0 | 0 |
| 26.01.2023 00:00 - 01:00 | 0 | -800 | 0 | 0 |
| 26.01.2023 01:00 - 02:00 | 0 | -800 | 0 | 0 |
| 26.01.2023 02:00 - 03:00 | 0 | -800 | 0 | 0 |
| 26.01.2023 03:00 - 04:00 | 0 | -800 | 0 | 0 |
| 26.01.2023 04:00 - 05:00 | 0 | -800 | 0 | 0 |
| 26.01.2023 05:00 - 06:00 | 0 | -800 | 0 | 0 |
| 26.01.2023 06:00 - 07:00 | 0 | 0 | 0 | 0 |
| 26.01.2023 07:00 - 08:00 | 0 | 0 | 0 | 0 |
| 26.01.2023 08:00 - 09:00 | 0 | 0 | 0 | 0 |
| 26.01.2023 09:00 - 10:00 | 0 | 0 | 0 | 0 |
| 26.01.2023 10:00 - 11:00 | 0 | 0 | 0 | 0 |
| 26.01.2023 11:00 - 12:00 | 0 | 0 | 0 | 0 |
| 26.01.2023 12:00 - 13:00 | 0 | 0 | 0 | 0 |
| 26.01.2023 13:00 - 14:00 | 0 | 0 | 0 | 0 |
| 26.01.2023 14:00 - 15:00 | 0 | -400 | 0 | 0 |
| 26.01.2023 15:00 - 16:00 | 0 | -400 | 0 | 0 |
| 26.01.2023 16:00 - 17:00 | 0 | -800 | 0 | 0 |
| 26.01.2023 17:00 - 18:00 | 0 | -800 | 0 | 0 |
| 26.01.2023 18:00 - 19:00 | 0 | -800 | 0 | 0 |
| 26.01.2023 19:00 - 20:00 | 0 | -1200 | 0 | 0 |
| 26.01.2023 20:00 - 21:00 | 0 | -1200 | 0 | 0 |
| 26.01.2023 21:00 - 22:00 | 0 | -1200 | 0 | 0 |
| 26.01.2023 22:00 - 23:00 | 0 | -1200 | 0 | 0 |
| 26.01.2023 23:00 - 24:00 | 0 | -1200 | 0 | 0 |
| 27.01.2023 00:00 - 01:00 | 0 | -1200 | 0 | 0 |
| 27.01.2023 01:00 - 02:00 | 0 | -1200 | 0 | 0 |
| 27.01.2023 02:00 - 03:00 | 0 | -1200 | 0 | 0 |
| 27.01.2023 03:00 - 04:00 | 0 | -1200 | 0 | 0 |
| 27.01.2023 04:00 - 05:00 | 0 | -1200 | 0 | 0 |
| 27.01.2023 05:00 - 06:00 | 0 | -1200 | 0 | 0 |
| 27.01.2023 06:00 - 07:00 | 0 | 0 | 0 | 0 |
| 27.01.2023 07:00 - 08:00 | 0 | 0 | 0 | 0 |
| 27.01.2023 08:00 - 09:00 | 0 | 0 | 0 | 0 |
| 27.01.2023 09:00 - 10:00 | 0 | 0 | 0 | 0 |
| 27.01.2023 10:00 - 11:00 | 0 | 0 | 0 | 0 |
| 27.01.2023 11:00 - 12:00 | 0 | 0 | 0 | 0 |
| 27.01.2023 12:00 - 13:00 | 0 | 0 | 0 | 0 |
| 27.01.2023 13:00 - 14:00 | 0 | 0 | 0 | 0 |
| 27.01.2023 14:00 - 15:00 | 0 | 0 | 0 | 0 |
| 27.01.2023 15:00 - 16:00 | 0 | 0 | 0 | 0 |
| 27.01.2023 16:00 - 17:00 | 0 | 0 | 0 | 0 |
| 27.01.2023 17:00 - 18:00 | 0 | 0 | 0 | 0 |
| 27.01.2023 18:00 - 19:00 | 0 | 0 | 0 | 0 |
| 27.01.2023 19:00 - 20:00 | 0 | 0 | 0 | 0 |
| 27.01.2023 20:00 - 21:00 | 0 | 0 | 0 | 0 |
| 27.01.2023 21:00 - 22:00 | 0 | 0 | 0 | 0 |
| 27.01.2023 22:00 - 23:00 | 0 | 0 | 0 | 0 |
| 27.01.2023 23:00 - 24:00 | 0 | 0 | 0 | 0 |
| 28.01.2023 00:00 - 01:00 | 0 | 0 | 0 | 0 |
| 28.01.2023 01:00 - 02:00 | 0 | 0 | 0 | 0 |
| 28.01.2023 02:00 - 03:00 | 0 | 0 | 0 | 0 |
| 28.01.2023 03:00 - 04:00 | 0 | 0 | 0 | 0 |
| 28.01.2023 04:00 - 05:00 | 0 | 0 | 0 | 0 |
| 28.01.2023 05:00 - 06:00 | 0 | 0 | 0 | 0 |
| 28.01.2023 06:00 - 07:00 | 0 | 0 | 0 | 0 |
| 28.01.2023 07:00 - 08:00 | 0 | 0 | 0 | 0 |
| 28.01.2023 08:00 - 09:00 | 0 | 0 | 0 | 0 |
| 28.01.2023 09:00 - 10:00 | 0 | 0 | 0 | 0 |
| 28.01.2023 10:00 - 11:00 | 0 | 0 | 0 | 0 |
| 28.01.2023 11:00 - 12:00 | 0 | 0 | 0 | 0 |
| 28.01.2023 12:00 - 13:00 | 0 | 0 | 0 | 0 |
| 28.01.2023 13:00 - 14:00 | 0 | 0 | 0 | 0 |
| 28.01.2023 14:00 - 15:00 | 0 | 0 | 0 | 0 |
| 28.01.2023 15:00 - 16:00 | 0 | 0 | 0 | 0 |
| 28.01.2023 16:00 - 17:00 | 0 | 0 | 0 | 0 |
| 28.01.2023 17:00 - 18:00 | 0 | 0 | 0 | 0 |
| 28.01.2023 18:00 - 19:00 | 0 | 0 | 0 | 0 |
| 28.01.2023 19:00 - 20:00 | 0 | 0 | 0 | 0 |
| 28.01.2023 20:00 - 21:00 | 0 | 0 | 0 | 0 |
| 28.01.2023 21:00 - 22:00 | 0 | 0 | 0 | 0 |
| 28.01.2023 22:00 - 23:00 | 0 | -1000 | 0 | 0 |
| 28.01.2023 23:00 - 24:00 | 0 | -1000 | 0 | 0 |
| 29.01.2023 00:00 - 01:00 | 0 | -1500 | 0 | 0 |
| 29.01.2023 01:00 - 02:00 | 0 | -1500 | 0 | 0 |
| 29.01.2023 02:00 - 03:00 | 0 | -1500 | 0 | 0 |
| 29.01.2023 03:00 - 04:00 | 0 | -1500 | 0 | 0 |
| 29.01.2023 04:00 - 05:00 | 0 | -1500 | 0 | 0 |
| 29.01.2023 05:00 - 06:00 | 0 | -1500 | 0 | 0 |
| 29.01.2023 06:00 - 07:00 | 0 | 0 | 0 | 0 |
| 29.01.2023 07:00 - 08:00 | 0 | 0 | 0 | 0 |
| 29.01.2023 08:00 - 09:00 | 0 | 0 | 0 | 0 |
| 29.01.2023 09:00 - 10:00 | 0 | 0 | 0 | 0 |
| 29.01.2023 10:00 - 11:00 | 0 | 0 | 0 | 0 |
| 29.01.2023 11:00 - 12:00 | 0 | 0 | 0 | 0 |
| 29.01.2023 12:00 - 13:00 | 0 | 0 | 0 | 0 |
| 29.01.2023 13:00 - 14:00 | 0 | 0 | 0 | 0 |
| 29.01.2023 14:00 - 15:00 | 0 | 0 | 0 | 0 |
| 29.01.2023 15:00 - 16:00 | 0 | -600 | 0 | 0 |
| 29.01.2023 16:00 - 17:00 | 0 | -600 | 0 | 0 |
| 29.01.2023 17:00 - 18:00 | 0 | -600 | 0 | 0 |
| 29.01.2023 18:00 - 19:00 | 0 | -600 | 0 | 0 |
| 29.01.2023 19:00 - 20:00 | 0 | -600 | 0 | 0 |
| 29.01.2023 20:00 - 21:00 | 0 | -600 | 0 | 0 |
| 29.01.2023 21:00 - 22:00 | 0 | -600 | 0 | 0 |
| 29.01.2023 22:00 - 23:00 | 0 | -600 | 0 | 0 |
| 29.01.2023 23:00 - 24:00 | 0 | -600 | 0 | 0 |
| 30.01.2023 00:00 - 01:00 | 0 | -600 | 0 | 0 |
| 30.01.2023 01:00 - 02:00 | 0 | -600 | 0 | 0 |
| 30.01.2023 02:00 - 03:00 | 0 | -600 | 0 | 0 |
| 30.01.2023 03:00 - 04:00 | 0 | -600 | 0 | 0 |
| 30.01.2023 04:00 - 05:00 | 0 | -600 | 0 | 0 |
| 30.01.2023 05:00 - 06:00 | 0 | -600 | 0 | 0 |
| 30.01.2023 06:00 - 07:00 | 0 | 0 | 0 | 0 |
| 30.01.2023 07:00 - 08:00 | 0 | 0 | 0 | 0 |
| 30.01.2023 08:00 - 09:00 | 0 | 0 | 0 | 0 |
| 30.01.2023 09:00 - 10:00 | 0 | 0 | 0 | 0 |
| 30.01.2023 10:00 - 11:00 | 0 | 0 | 0 | 0 |
| 30.01.2023 11:00 - 12:00 | 0 | 0 | 0 | 0 |
| 30.01.2023 12:00 - 13:00 | 0 | 0 | 0 | 0 |
| 30.01.2023 13:00 - 14:00 | 0 | 0 | 0 | 0 |
| 30.01.2023 14:00 - 15:00 | 0 | 0 | 0 | 0 |
| 30.01.2023 15:00 - 16:00 | 0 | 0 | 0 | 0 |
| 30.01.2023 16:00 - 17:00 | 0 | 0 | 0 | 0 |
| 30.01.2023 17:00 - 18:00 | 0 | 0 | 0 | 0 |
| 30.01.2023 18:00 - 19:00 | 0 | 0 | 0 | 0 |
| 30.01.2023 19:00 - 20:00 | 0 | 0 | 0 | 0 |
| 30.01.2023 20:00 - 21:00 | 0 | 0 | 0 | 0 |
| 30.01.2023 21:00 - 22:00 | 0 | 0 | 0 | 0 |
| 30.01.2023 22:00 - 23:00 | 0 | 0 | 0 | 0 |
| 30.01.2023 23:00 - 24:00 | 0 | 0 | 0 | 0 |
| 31.01.2023 00:00 - 01:00 | 0 | 0 | 0 | 0 |
| 31.01.2023 01:00 - 02:00 | 0 | 0 | 0 | 0 |
| 31.01.2023 02:00 - 03:00 | 0 | 0 | 0 | 0 |
| 31.01.2023 03:00 - 04:00 | 0 | 0 | 0 | 0 |
| 31.01.2023 04:00 - 05:00 | 0 | 0 | 0 | 0 |
| 31.01.2023 05:00 - 06:00 | 0 | 0 | 0 | 0 |